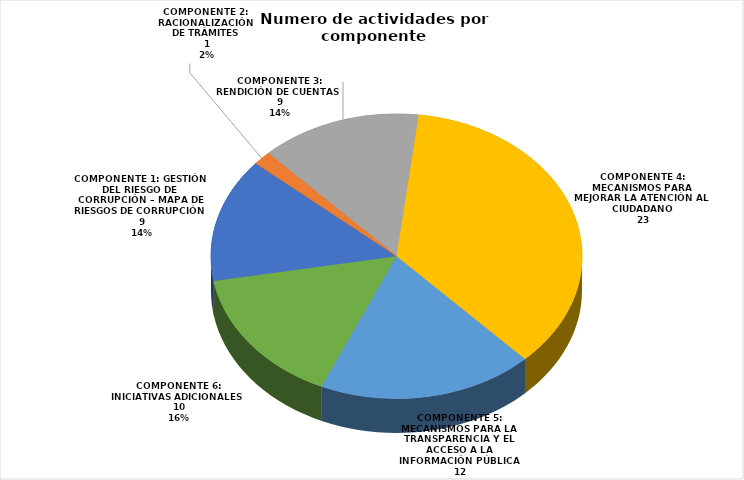
| Category | Cantidad de Actividades |
|---|---|
| COMPONENTE 1: GESTIÓN DEL RIESGO DE CORRUPCIÓN – MAPA DE RIESGOS DE CORRUPCIÓN | 9 |
| COMPONENTE 2: RACIONALIZACIÓN DE TRÁMITES | 1 |
| COMPONENTE 3: RENDICIÓN DE CUENTAS | 9 |
| COMPONENTE 4: MECANISMOS PARA MEJORAR LA ATENCIÓN AL CIUDADANO | 23 |
| COMPONENTE 5: MECANISMOS PARA LA TRANSPARENCIA Y EL ACCESO A LA INFORMACIÓN PÚBLICA | 12 |
| COMPONENTE 6: INICIATIVAS ADICIONALES | 10 |